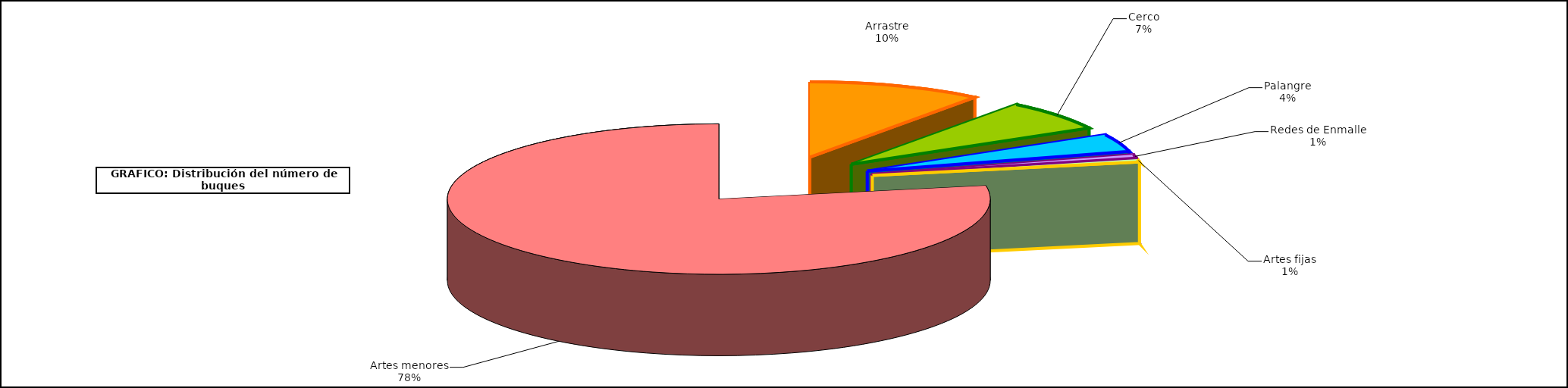
| Category | Series1 |
|---|---|
| 0 | 978 |
| 1 | 620 |
| 2 | 356 |
| 3 | 72 |
| 4 | 57 |
| 5 | 7326 |